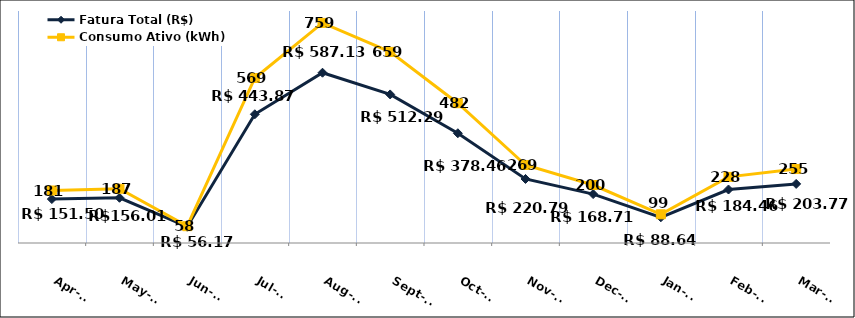
| Category | Fatura Total (R$) |
|---|---|
| 2023-04-01 | 151.5 |
| 2023-05-01 | 156.01 |
| 2023-06-01 | 56.17 |
| 2023-07-01 | 443.87 |
| 2023-08-01 | 587.13 |
| 2023-09-01 | 512.29 |
| 2023-10-01 | 378.46 |
| 2023-11-01 | 220.79 |
| 2023-12-01 | 168.71 |
| 2024-01-01 | 88.64 |
| 2024-02-01 | 184.46 |
| 2024-03-01 | 203.77 |